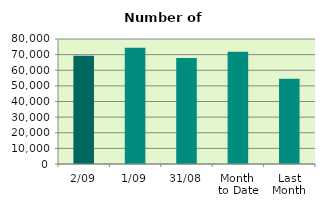
| Category | Series 0 |
|---|---|
| 2/09 | 69204 |
| 1/09 | 74392 |
| 31/08 | 67812 |
| Month 
to Date | 71798 |
| Last
Month | 54581.565 |